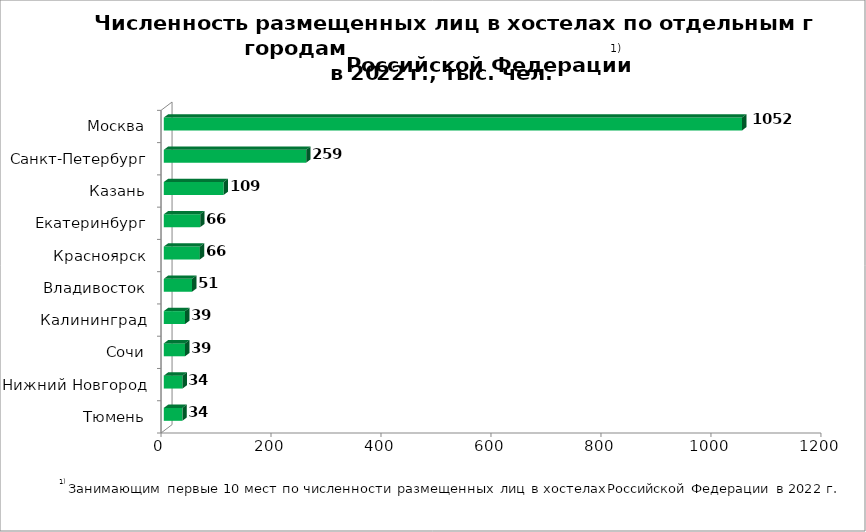
| Category | Series 0 |
|---|---|
| Тюмень | 33.799 |
| Нижний Новгород | 34.077 |
| Сочи | 38.716 |
| Калининград | 38.751 |
| Владивосток | 51.367 |
| Красноярск | 65.604 |
| Екатеринбург | 66.082 |
| Казань | 108.899 |
| Санкт-Петербург | 258.955 |
| Москва | 1051.543 |